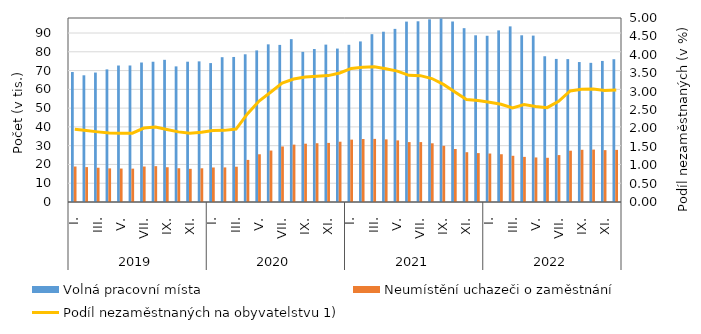
| Category | Volná pracovní místa | Neumístění uchazeči o zaměstnání |
|---|---|---|
| 0 | 69225 | 18908 |
| 1 | 67484 | 18592 |
| 2 | 68946 | 18254 |
| 3 | 70640 | 17913 |
| 4 | 72690 | 17821 |
| 5 | 72705 | 17771 |
| 6 | 74296 | 18895 |
| 7 | 74706 | 19089 |
| 8 | 75727 | 18515 |
| 9 | 72231 | 17985 |
| 10 | 74722 | 17666 |
| 11 | 74905 | 17955 |
| 12 | 73987 | 18390 |
| 13 | 77123 | 18423 |
| 14 | 77251 | 18788 |
| 15 | 78679 | 22421 |
| 16 | 80742 | 25424 |
| 17 | 83969 | 27405 |
| 18 | 83672 | 29567 |
| 19 | 86744 | 30556 |
| 20 | 79961 | 31056 |
| 21 | 81479 | 31302 |
| 22 | 83826 | 31473 |
| 23 | 81719 | 32107 |
| 24 | 83735 | 33217 |
| 25 | 85524 | 33565 |
| 26 | 89385 | 33612 |
| 27 | 90690 | 33352 |
| 28 | 92204 | 32808 |
| 29 | 96081 | 31905 |
| 30 | 96249 | 31917 |
| 31 | 97288 | 31271 |
| 32 | 97734 | 29926 |
| 33 | 96137 | 28242 |
| 34 | 92587 | 26521 |
| 35 | 88785 | 26047 |
| 36 | 88536 | 25817 |
| 37 | 91403 | 25444 |
| 38 | 93541 | 24612 |
| 39 | 88791 | 24028 |
| 40 | 88625 | 23728 |
| 41 | 77627 | 23550 |
| 42 | 76207 | 24989 |
| 43 | 76110 | 27326 |
| 44 | 74541 | 27809 |
| 45 | 74117 | 27914 |
| 46 | 75125 | 27625 |
| 47 | 76045 | 27766 |